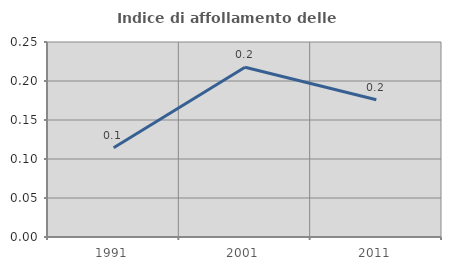
| Category | Indice di affollamento delle abitazioni  |
|---|---|
| 1991.0 | 0.114 |
| 2001.0 | 0.218 |
| 2011.0 | 0.176 |